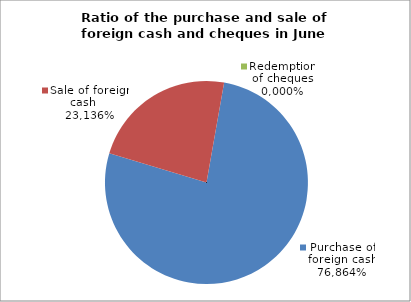
| Category | Purchase of foreign cash |
|---|---|
| 0 | 0.769 |
| 1 | 0.231 |
| 2 | 0 |